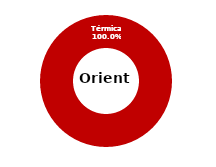
| Category | Oriente |
|---|---|
| Eólica | 0 |
| Hidráulica | 0 |
| Solar | 0 |
| Térmica | 33.738 |